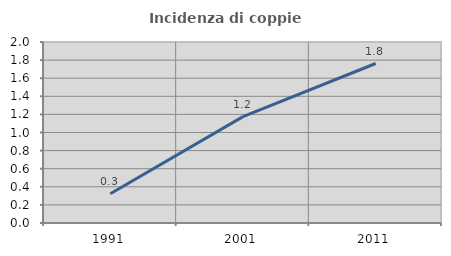
| Category | Incidenza di coppie miste |
|---|---|
| 1991.0 | 0.324 |
| 2001.0 | 1.175 |
| 2011.0 | 1.762 |